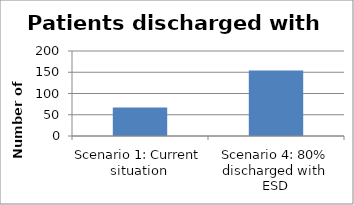
| Category | Number of patients |
|---|---|
| Scenario 1: Current situation | 67 |
| Scenario 4: 80% discharged with ESD | 154 |